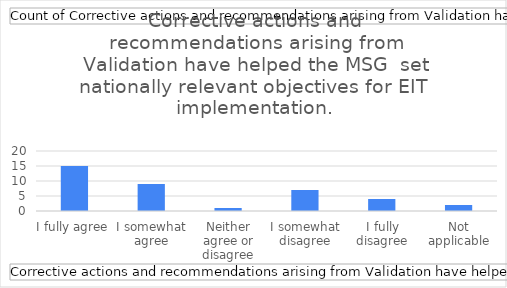
| Category | Total |
|---|---|
| I fully agree | 15 |
| I somewhat agree | 9 |
| Neither agree or disagree | 1 |
| I somewhat disagree | 7 |
| I fully disagree | 4 |
| Not applicable | 2 |